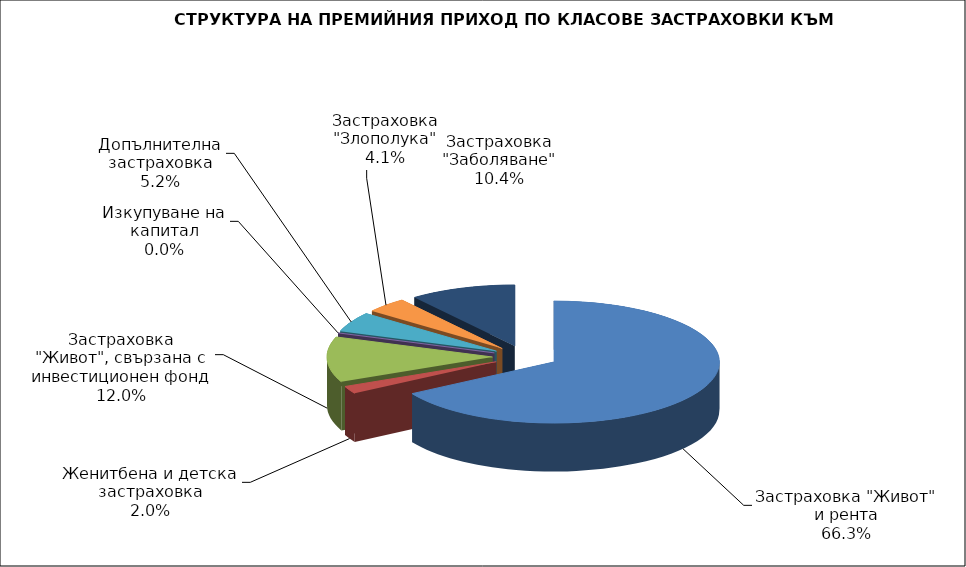
| Category | Series 0 |
|---|---|
| Застраховка "Живот" и рента | 103700729.496 |
| Женитбена и детска застраховка | 3139271.828 |
| Застраховка "Живот", свързана с инвестиционен фонд | 18752193.944 |
| Изкупуване на капитал | 0 |
| Допълнителна застраховка | 8203472.842 |
| Застраховка "Злополука" | 6345958.02 |
| Застраховка "Заболяване" | 16202033.07 |